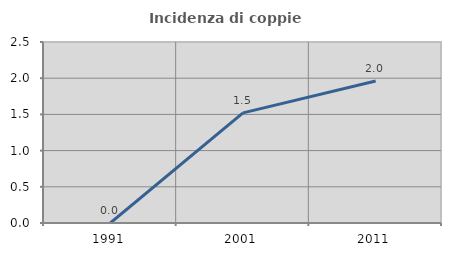
| Category | Incidenza di coppie miste |
|---|---|
| 1991.0 | 0 |
| 2001.0 | 1.521 |
| 2011.0 | 1.961 |